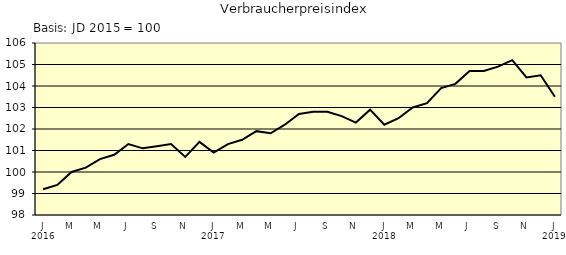
| Category | Series 0 |
|---|---|
| 0 | 99.2 |
| 1 | 99.4 |
| 2 | 100 |
| 3 | 100.2 |
| 4 | 100.6 |
| 5 | 100.8 |
| 6 | 101.3 |
| 7 | 101.1 |
| 8 | 101.2 |
| 9 | 101.3 |
| 10 | 100.7 |
| 11 | 101.4 |
| 12 | 100.9 |
| 13 | 101.3 |
| 14 | 101.5 |
| 15 | 101.9 |
| 16 | 101.8 |
| 17 | 102.2 |
| 18 | 102.7 |
| 19 | 102.8 |
| 20 | 102.8 |
| 21 | 102.6 |
| 22 | 102.3 |
| 23 | 102.9 |
| 24 | 102.2 |
| 25 | 102.5 |
| 26 | 103 |
| 27 | 103.2 |
| 28 | 103.9 |
| 29 | 104.1 |
| 30 | 104.7 |
| 31 | 104.7 |
| 32 | 104.9 |
| 33 | 105.2 |
| 34 | 104.4 |
| 35 | 104.5 |
| 36 | 103.5 |